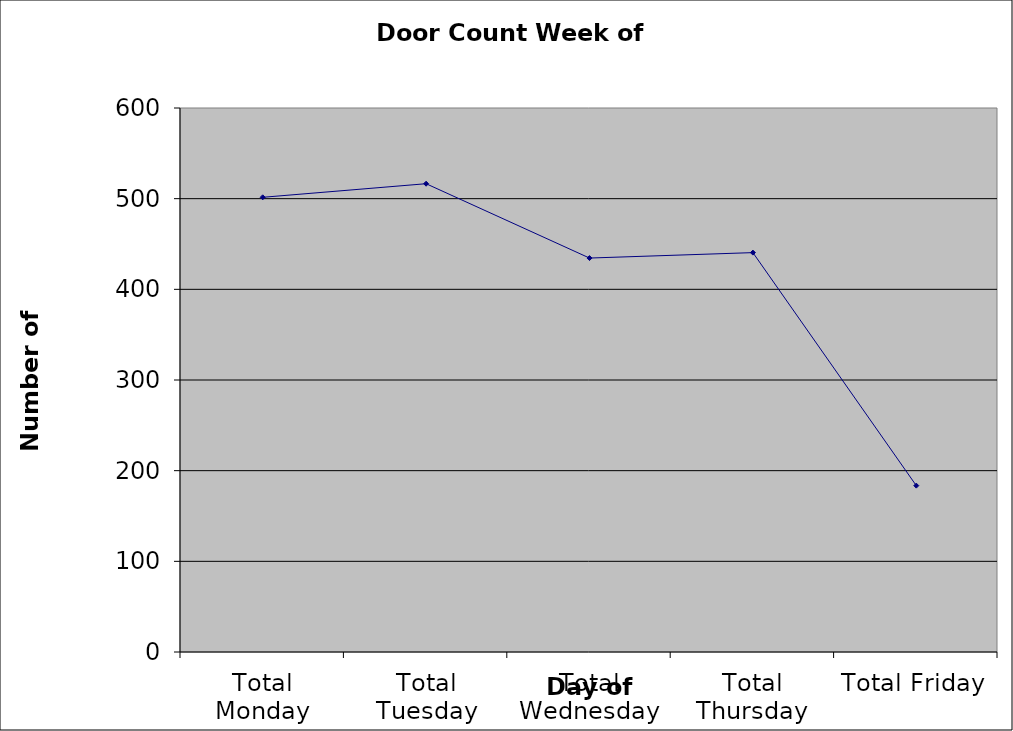
| Category | Series 0 |
|---|---|
| Total Monday | 501.5 |
| Total Tuesday | 516.5 |
| Total Wednesday | 434.5 |
| Total Thursday | 440.5 |
| Total Friday | 183.5 |